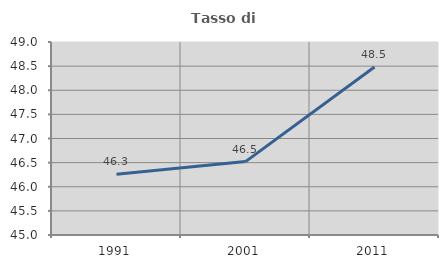
| Category | Tasso di occupazione   |
|---|---|
| 1991.0 | 46.259 |
| 2001.0 | 46.521 |
| 2011.0 | 48.482 |